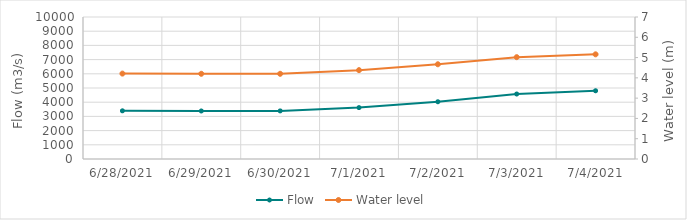
| Category | Flow |
|---|---|
| 6/6/21 | 7487.85 |
| 6/5/21 | 7529.57 |
| 6/4/21 | 7183.33 |
| 6/3/21 | 6742.99 |
| 6/2/21 | 6459.87 |
| 6/1/21 | 6462.29 |
| 5/31/21 | 6483.05 |